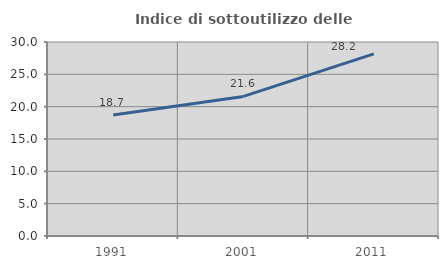
| Category | Indice di sottoutilizzo delle abitazioni  |
|---|---|
| 1991.0 | 18.7 |
| 2001.0 | 21.584 |
| 2011.0 | 28.173 |